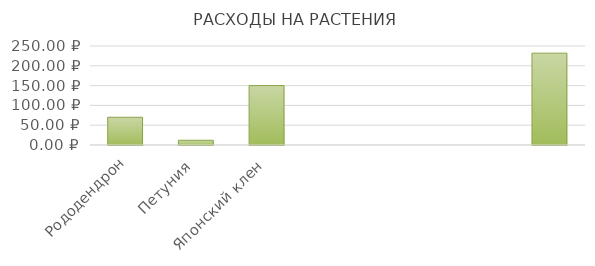
| Category | Рододендрон |
|---|---|
| Рододендрон | 70 |
| Петуния | 11.94 |
| Японский клен | 150 |